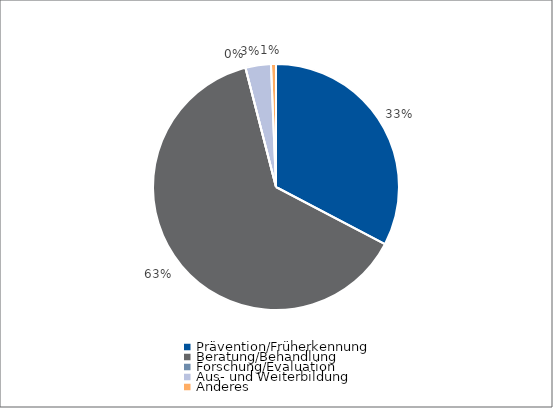
| Category | Series 0 |
|---|---|
| Prävention/Früherkennung | 32852 |
| Beratung/Behandlung | 63648 |
| Forschung/Evaluation | 0 |
| Aus- und Weiterbildung | 3353 |
| Anderes | 662 |